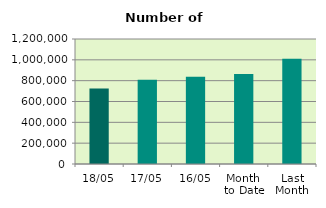
| Category | Series 0 |
|---|---|
| 18/05 | 724054 |
| 17/05 | 808710 |
| 16/05 | 837656 |
| Month 
to Date | 863795.077 |
| Last
Month | 1010681.333 |